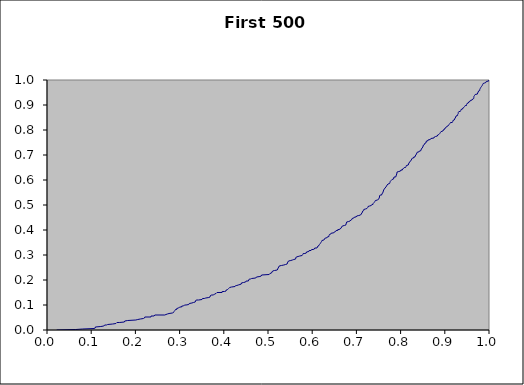
| Category | Series 0 |
|---|---|
| 0.021897918081891826 | 0 |
| 0.021897918081891826 | 0.002 |
| 0.06523315118367282 | 0.002 |
| 0.06523315118367282 | 0.004 |
| 0.0807544607324291 | 0.004 |
| 0.0807544607324291 | 0.006 |
| 0.10646404156951107 | 0.006 |
| 0.10646404156951107 | 0.008 |
| 0.1092573643612986 | 0.008 |
| 0.1092573643612986 | 0.01 |
| 0.10928343912602351 | 0.01 |
| 0.10928343912602351 | 0.012 |
| 0.11061091958944612 | 0.012 |
| 0.11061091958944612 | 0.014 |
| 0.12171973786751943 | 0.014 |
| 0.12171973786751943 | 0.016 |
| 0.1285424942450191 | 0.016 |
| 0.1285424942450191 | 0.018 |
| 0.1304585118417624 | 0.018 |
| 0.1304585118417624 | 0.02 |
| 0.13455305386940608 | 0.02 |
| 0.13455305386940608 | 0.022 |
| 0.13728534370316464 | 0.022 |
| 0.13728534370316464 | 0.024 |
| 0.14861249581178348 | 0.024 |
| 0.14861249581178348 | 0.026 |
| 0.15590705263605067 | 0.026 |
| 0.15590705263605067 | 0.028 |
| 0.1581368723343945 | 0.028 |
| 0.1581368723343945 | 0.03 |
| 0.16342433042483748 | 0.03 |
| 0.16342433042483748 | 0.032 |
| 0.1750887045038983 | 0.032 |
| 0.1750887045038983 | 0.034 |
| 0.17592749082593775 | 0.034 |
| 0.17592749082593775 | 0.036 |
| 0.17764236055978683 | 0.036 |
| 0.17764236055978683 | 0.038 |
| 0.18276183317802958 | 0.038 |
| 0.18276183317802958 | 0.04 |
| 0.20105487485812018 | 0.04 |
| 0.20105487485812018 | 0.042 |
| 0.20536459177715305 | 0.042 |
| 0.20536459177715305 | 0.044 |
| 0.21104864177050434 | 0.044 |
| 0.21104864177050434 | 0.046 |
| 0.21815375393502112 | 0.046 |
| 0.21815375393502112 | 0.048 |
| 0.22053192893236662 | 0.048 |
| 0.22053192893236662 | 0.05 |
| 0.22124137839260483 | 0.05 |
| 0.22124137839260483 | 0.052 |
| 0.2350986549685867 | 0.052 |
| 0.2350986549685867 | 0.054 |
| 0.23540107716843792 | 0.054 |
| 0.23540107716843792 | 0.056 |
| 0.24229875351471067 | 0.056 |
| 0.24229875351471067 | 0.058 |
| 0.24387414313903658 | 0.058 |
| 0.24387414313903658 | 0.06 |
| 0.2664827592374227 | 0.06 |
| 0.2664827592374227 | 0.062 |
| 0.26918575447161736 | 0.062 |
| 0.26918575447161736 | 0.064 |
| 0.2722355204352449 | 0.064 |
| 0.2722355204352449 | 0.066 |
| 0.2761165909060285 | 0.066 |
| 0.2761165909060285 | 0.068 |
| 0.2835442600330927 | 0.068 |
| 0.2835442600330927 | 0.07 |
| 0.2862815536726706 | 0.07 |
| 0.2862815536726706 | 0.072 |
| 0.2874402215660074 | 0.072 |
| 0.2874402215660074 | 0.074 |
| 0.2889093945239742 | 0.074 |
| 0.2889093945239742 | 0.076 |
| 0.2893299529715815 | 0.076 |
| 0.2893299529715815 | 0.078 |
| 0.29059601815584263 | 0.078 |
| 0.29059601815584263 | 0.08 |
| 0.29066765360203234 | 0.08 |
| 0.29066765360203234 | 0.082 |
| 0.293387623630287 | 0.082 |
| 0.293387623630287 | 0.084 |
| 0.293471716909933 | 0.084 |
| 0.293471716909933 | 0.086 |
| 0.29422580143166954 | 0.086 |
| 0.29422580143166954 | 0.088 |
| 0.2977863811714314 | 0.088 |
| 0.2977863811714314 | 0.09 |
| 0.30002222580208876 | 0.09 |
| 0.30002222580208876 | 0.092 |
| 0.30449822905675206 | 0.092 |
| 0.30449822905675206 | 0.094 |
| 0.3049871862406665 | 0.094 |
| 0.3049871862406665 | 0.096 |
| 0.3087590019793998 | 0.096 |
| 0.3087590019793998 | 0.098 |
| 0.3109875620651161 | 0.098 |
| 0.3109875620651161 | 0.1 |
| 0.3145524105345959 | 0.1 |
| 0.3145524105345959 | 0.102 |
| 0.32080660699942676 | 0.102 |
| 0.32080660699942676 | 0.104 |
| 0.3218245111582825 | 0.104 |
| 0.3218245111582825 | 0.106 |
| 0.32325844579217367 | 0.106 |
| 0.32325844579217367 | 0.108 |
| 0.3278516912646725 | 0.108 |
| 0.3278516912646725 | 0.11 |
| 0.3311631151056512 | 0.11 |
| 0.3311631151056512 | 0.112 |
| 0.33536681212985264 | 0.112 |
| 0.33536681212985264 | 0.114 |
| 0.3360530583206744 | 0.114 |
| 0.3360530583206744 | 0.116 |
| 0.33727365891195454 | 0.116 |
| 0.33727365891195454 | 0.118 |
| 0.33761581012432174 | 0.118 |
| 0.33761581012432174 | 0.12 |
| 0.34282517261200224 | 0.12 |
| 0.34282517261200224 | 0.122 |
| 0.35070825327676586 | 0.122 |
| 0.35070825327676586 | 0.124 |
| 0.3517873820542869 | 0.124 |
| 0.3517873820542869 | 0.126 |
| 0.35574020971307757 | 0.126 |
| 0.35574020971307757 | 0.128 |
| 0.35921498873511853 | 0.128 |
| 0.35921498873511853 | 0.13 |
| 0.36608536857781754 | 0.13 |
| 0.36608536857781754 | 0.132 |
| 0.3689463281720448 | 0.132 |
| 0.3689463281720448 | 0.134 |
| 0.3692220418669596 | 0.134 |
| 0.3692220418669596 | 0.136 |
| 0.370487820085008 | 0.136 |
| 0.370487820085008 | 0.138 |
| 0.3714711372366517 | 0.138 |
| 0.3714711372366517 | 0.14 |
| 0.3768092378812035 | 0.14 |
| 0.3768092378812035 | 0.142 |
| 0.3790477668345028 | 0.142 |
| 0.3790477668345028 | 0.144 |
| 0.3807772708818114 | 0.144 |
| 0.3807772708818114 | 0.146 |
| 0.3824347860305835 | 0.146 |
| 0.3824347860305835 | 0.148 |
| 0.3845599507331962 | 0.148 |
| 0.3845599507331962 | 0.15 |
| 0.39610399991559364 | 0.15 |
| 0.39610399991559364 | 0.152 |
| 0.39628005008507333 | 0.152 |
| 0.39628005008507333 | 0.154 |
| 0.4016791358136964 | 0.154 |
| 0.4016791358136964 | 0.156 |
| 0.4050719875682554 | 0.156 |
| 0.4050719875682554 | 0.158 |
| 0.40547329463613474 | 0.158 |
| 0.40547329463613474 | 0.16 |
| 0.4058862553466577 | 0.16 |
| 0.4058862553466577 | 0.162 |
| 0.4087463465819142 | 0.162 |
| 0.4087463465819142 | 0.164 |
| 0.4109655259528265 | 0.164 |
| 0.4109655259528265 | 0.166 |
| 0.41125949607083 | 0.166 |
| 0.41125949607083 | 0.168 |
| 0.4131650342620507 | 0.168 |
| 0.4131650342620507 | 0.17 |
| 0.41357675492989415 | 0.17 |
| 0.41357675492989415 | 0.172 |
| 0.417493631801864 | 0.172 |
| 0.417493631801864 | 0.174 |
| 0.4255545243436441 | 0.174 |
| 0.4255545243436441 | 0.176 |
| 0.4269480113402916 | 0.176 |
| 0.4269480113402916 | 0.178 |
| 0.4294714508657256 | 0.178 |
| 0.4294714508657256 | 0.18 |
| 0.43261605053863406 | 0.18 |
| 0.43261605053863406 | 0.182 |
| 0.43664353031998987 | 0.182 |
| 0.43664353031998987 | 0.184 |
| 0.4396434383547464 | 0.184 |
| 0.4396434383547464 | 0.186 |
| 0.4397017219194328 | 0.186 |
| 0.4397017219194328 | 0.188 |
| 0.44053109392780376 | 0.188 |
| 0.44053109392780376 | 0.19 |
| 0.4445297881575609 | 0.19 |
| 0.4445297881575609 | 0.192 |
| 0.44939216450777775 | 0.192 |
| 0.44939216450777775 | 0.194 |
| 0.450599185572192 | 0.194 |
| 0.450599185572192 | 0.196 |
| 0.4555851932242986 | 0.196 |
| 0.4555851932242986 | 0.198 |
| 0.4565087693150965 | 0.198 |
| 0.4565087693150965 | 0.2 |
| 0.457504789345731 | 0.2 |
| 0.457504789345731 | 0.202 |
| 0.45787742815257404 | 0.202 |
| 0.45787742815257404 | 0.204 |
| 0.46041356228416236 | 0.204 |
| 0.46041356228416236 | 0.206 |
| 0.46294729006585267 | 0.206 |
| 0.46294729006585267 | 0.208 |
| 0.4723377382072869 | 0.208 |
| 0.4723377382072869 | 0.21 |
| 0.47379882273148494 | 0.21 |
| 0.47379882273148494 | 0.212 |
| 0.4747578372860722 | 0.212 |
| 0.4747578372860722 | 0.214 |
| 0.4817563442199761 | 0.214 |
| 0.4817563442199761 | 0.216 |
| 0.4845554604608543 | 0.216 |
| 0.4845554604608543 | 0.218 |
| 0.4855100597031753 | 0.218 |
| 0.4855100597031753 | 0.22 |
| 0.48736225417345536 | 0.22 |
| 0.48736225417345536 | 0.222 |
| 0.5026501339941281 | 0.222 |
| 0.5026501339941281 | 0.224 |
| 0.5042813666066718 | 0.224 |
| 0.5042813666066718 | 0.226 |
| 0.5045342969493823 | 0.226 |
| 0.5045342969493823 | 0.228 |
| 0.5079773136335938 | 0.228 |
| 0.5079773136335938 | 0.23 |
| 0.5089497839653756 | 0.23 |
| 0.5089497839653756 | 0.232 |
| 0.5093478847308652 | 0.232 |
| 0.5093478847308652 | 0.234 |
| 0.5105190893524388 | 0.234 |
| 0.5105190893524388 | 0.236 |
| 0.5111668536550172 | 0.236 |
| 0.5111668536550172 | 0.238 |
| 0.514722558956099 | 0.238 |
| 0.514722558956099 | 0.24 |
| 0.5209627517010066 | 0.24 |
| 0.5209627517010066 | 0.242 |
| 0.5222140856684551 | 0.242 |
| 0.5222140856684551 | 0.244 |
| 0.5224796490614518 | 0.244 |
| 0.5224796490614518 | 0.246 |
| 0.5226923157140931 | 0.246 |
| 0.5226923157140931 | 0.248 |
| 0.5232346469884467 | 0.248 |
| 0.5232346469884467 | 0.25 |
| 0.524535123631277 | 0.25 |
| 0.524535123631277 | 0.252 |
| 0.5251040575780742 | 0.252 |
| 0.5251040575780742 | 0.254 |
| 0.5252651934115584 | 0.254 |
| 0.5252651934115584 | 0.256 |
| 0.5275197052584345 | 0.256 |
| 0.5275197052584345 | 0.258 |
| 0.5302459693545999 | 0.258 |
| 0.5302459693545999 | 0.26 |
| 0.5358197725093767 | 0.26 |
| 0.5358197725093767 | 0.262 |
| 0.5395910689444929 | 0.262 |
| 0.5395910689444929 | 0.264 |
| 0.5433550089578614 | 0.264 |
| 0.5433550089578614 | 0.266 |
| 0.5438411885343831 | 0.266 |
| 0.5438411885343831 | 0.268 |
| 0.5440309159428603 | 0.268 |
| 0.5440309159428603 | 0.27 |
| 0.5450122353596646 | 0.27 |
| 0.5450122353596646 | 0.272 |
| 0.545947966389704 | 0.272 |
| 0.545947966389704 | 0.274 |
| 0.5463656162412323 | 0.274 |
| 0.5463656162412323 | 0.276 |
| 0.5464352212521673 | 0.276 |
| 0.5464352212521673 | 0.278 |
| 0.5516540407877566 | 0.278 |
| 0.5516540407877566 | 0.28 |
| 0.5551500112860211 | 0.28 |
| 0.5551500112860211 | 0.282 |
| 0.5583286015876231 | 0.282 |
| 0.5583286015876231 | 0.284 |
| 0.5626280067760266 | 0.284 |
| 0.5626280067760266 | 0.286 |
| 0.5627445769298121 | 0.286 |
| 0.5627445769298121 | 0.288 |
| 0.5638732604246404 | 0.288 |
| 0.5638732604246404 | 0.29 |
| 0.5639650438164676 | 0.29 |
| 0.5639650438164676 | 0.292 |
| 0.5643976594642972 | 0.292 |
| 0.5643976594642972 | 0.294 |
| 0.5680648654399378 | 0.294 |
| 0.5680648654399378 | 0.296 |
| 0.5718063373089591 | 0.296 |
| 0.5718063373089591 | 0.298 |
| 0.5771866483174436 | 0.298 |
| 0.5771866483174436 | 0.3 |
| 0.5786389403124875 | 0.3 |
| 0.5786389403124875 | 0.302 |
| 0.5787774493492687 | 0.302 |
| 0.5787774493492687 | 0.304 |
| 0.5796776962765396 | 0.304 |
| 0.5796776962765396 | 0.306 |
| 0.5833835432091734 | 0.306 |
| 0.5833835432091734 | 0.308 |
| 0.586673400013422 | 0.308 |
| 0.586673400013422 | 0.31 |
| 0.5869734183578232 | 0.31 |
| 0.5869734183578232 | 0.312 |
| 0.587597544816653 | 0.312 |
| 0.587597544816653 | 0.314 |
| 0.5924530931749203 | 0.314 |
| 0.5924530931749203 | 0.316 |
| 0.5931702757522926 | 0.316 |
| 0.5931702757522926 | 0.318 |
| 0.59746225229825 | 0.318 |
| 0.59746225229825 | 0.32 |
| 0.5986512667009289 | 0.32 |
| 0.5986512667009289 | 0.322 |
| 0.6020101268498207 | 0.322 |
| 0.6020101268498207 | 0.324 |
| 0.6051132932854387 | 0.324 |
| 0.6051132932854387 | 0.326 |
| 0.6057763103128806 | 0.326 |
| 0.6057763103128806 | 0.328 |
| 0.6106860507347589 | 0.328 |
| 0.6106860507347589 | 0.33 |
| 0.6119188503874389 | 0.33 |
| 0.6119188503874389 | 0.332 |
| 0.6121558833473152 | 0.332 |
| 0.6121558833473152 | 0.334 |
| 0.6129847978524068 | 0.334 |
| 0.6129847978524068 | 0.336 |
| 0.6145048868322224 | 0.336 |
| 0.6145048868322224 | 0.338 |
| 0.6154327094016 | 0.338 |
| 0.6154327094016 | 0.34 |
| 0.616355204360489 | 0.34 |
| 0.616355204360489 | 0.342 |
| 0.6180251090993006 | 0.342 |
| 0.6180251090993006 | 0.344 |
| 0.6182573211400452 | 0.344 |
| 0.6182573211400452 | 0.346 |
| 0.6188268152584875 | 0.346 |
| 0.6188268152584875 | 0.348 |
| 0.6196592609244207 | 0.348 |
| 0.6196592609244207 | 0.35 |
| 0.6202401608683943 | 0.35 |
| 0.6202401608683943 | 0.352 |
| 0.6212044414760152 | 0.352 |
| 0.6212044414760152 | 0.354 |
| 0.6214380213070004 | 0.354 |
| 0.6214380213070004 | 0.356 |
| 0.6219687799350214 | 0.356 |
| 0.6219687799350214 | 0.358 |
| 0.6236564252665228 | 0.358 |
| 0.6236564252665228 | 0.36 |
| 0.6264756570670645 | 0.36 |
| 0.6264756570670645 | 0.362 |
| 0.627905607655712 | 0.362 |
| 0.627905607655712 | 0.364 |
| 0.6287738836301561 | 0.364 |
| 0.6287738836301561 | 0.366 |
| 0.6294430686842593 | 0.366 |
| 0.6294430686842593 | 0.368 |
| 0.6325986662555002 | 0.368 |
| 0.6325986662555002 | 0.37 |
| 0.6339704736572748 | 0.37 |
| 0.6339704736572748 | 0.372 |
| 0.6351498407558812 | 0.372 |
| 0.6351498407558812 | 0.374 |
| 0.6379083372527639 | 0.374 |
| 0.6379083372527639 | 0.376 |
| 0.6381330027209235 | 0.376 |
| 0.6381330027209235 | 0.378 |
| 0.6387644151629712 | 0.378 |
| 0.6387644151629712 | 0.38 |
| 0.6389945888632037 | 0.38 |
| 0.6389945888632037 | 0.382 |
| 0.639362838360495 | 0.382 |
| 0.639362838360495 | 0.384 |
| 0.6422337999780982 | 0.384 |
| 0.6422337999780982 | 0.386 |
| 0.64350231229169 | 0.386 |
| 0.64350231229169 | 0.388 |
| 0.6483094953767626 | 0.388 |
| 0.6483094953767626 | 0.39 |
| 0.6498340048658052 | 0.39 |
| 0.6498340048658052 | 0.392 |
| 0.6517704356523994 | 0.392 |
| 0.6517704356523994 | 0.394 |
| 0.6530821035511961 | 0.394 |
| 0.6530821035511961 | 0.396 |
| 0.654077805916523 | 0.396 |
| 0.654077805916523 | 0.398 |
| 0.6579374729901266 | 0.398 |
| 0.6579374729901266 | 0.4 |
| 0.6579604586271598 | 0.4 |
| 0.6579604586271598 | 0.402 |
| 0.660586238051264 | 0.402 |
| 0.660586238051264 | 0.404 |
| 0.6633924613668194 | 0.404 |
| 0.6633924613668194 | 0.406 |
| 0.6652625014112356 | 0.406 |
| 0.6652625014112356 | 0.408 |
| 0.6666106008838641 | 0.408 |
| 0.6666106008838641 | 0.41 |
| 0.6667663082441025 | 0.41 |
| 0.6667663082441025 | 0.412 |
| 0.6676059935887697 | 0.412 |
| 0.6676059935887697 | 0.414 |
| 0.6680865847296211 | 0.414 |
| 0.6680865847296211 | 0.416 |
| 0.6686750506797231 | 0.416 |
| 0.6686750506797231 | 0.418 |
| 0.67283254265387 | 0.418 |
| 0.67283254265387 | 0.42 |
| 0.6762284886850896 | 0.42 |
| 0.6762284886850896 | 0.422 |
| 0.6763473046152666 | 0.422 |
| 0.6763473046152666 | 0.424 |
| 0.6767232202972496 | 0.424 |
| 0.6767232202972496 | 0.426 |
| 0.6776075672373701 | 0.426 |
| 0.6776075672373701 | 0.428 |
| 0.6778118258765987 | 0.428 |
| 0.6778118258765987 | 0.43 |
| 0.6778582361262263 | 0.43 |
| 0.6778582361262263 | 0.432 |
| 0.6789905823304688 | 0.432 |
| 0.6789905823304688 | 0.434 |
| 0.682624196593867 | 0.434 |
| 0.682624196593867 | 0.436 |
| 0.6855616080756904 | 0.436 |
| 0.6855616080756904 | 0.438 |
| 0.6874446985646274 | 0.438 |
| 0.6874446985646274 | 0.44 |
| 0.6896915569578116 | 0.44 |
| 0.6896915569578116 | 0.442 |
| 0.6898571975173683 | 0.442 |
| 0.6898571975173683 | 0.444 |
| 0.6903026574554162 | 0.444 |
| 0.6903026574554162 | 0.446 |
| 0.6923813339461344 | 0.446 |
| 0.6923813339461344 | 0.448 |
| 0.6941687461939142 | 0.448 |
| 0.6941687461939142 | 0.45 |
| 0.6958572557928987 | 0.45 |
| 0.6958572557928987 | 0.452 |
| 0.6992722281819722 | 0.452 |
| 0.6992722281819722 | 0.454 |
| 0.7006465266287069 | 0.454 |
| 0.7006465266287069 | 0.456 |
| 0.7025308553214654 | 0.456 |
| 0.7025308553214654 | 0.458 |
| 0.7053757134470637 | 0.458 |
| 0.7053757134470637 | 0.46 |
| 0.7094359861818292 | 0.46 |
| 0.7094359861818292 | 0.462 |
| 0.7110020552571784 | 0.462 |
| 0.7110020552571784 | 0.464 |
| 0.7115600840500821 | 0.464 |
| 0.7115600840500821 | 0.466 |
| 0.7123260721053666 | 0.466 |
| 0.7123260721053666 | 0.468 |
| 0.7133662142828301 | 0.468 |
| 0.7133662142828301 | 0.47 |
| 0.7138754298990462 | 0.47 |
| 0.7138754298990462 | 0.472 |
| 0.7141230464399799 | 0.472 |
| 0.7141230464399799 | 0.474 |
| 0.7141568127062209 | 0.474 |
| 0.7141568127062209 | 0.476 |
| 0.715992288373078 | 0.476 |
| 0.715992288373078 | 0.478 |
| 0.7165571234462058 | 0.478 |
| 0.7165571234462058 | 0.48 |
| 0.7166873041495803 | 0.48 |
| 0.7166873041495803 | 0.482 |
| 0.718014460256699 | 0.482 |
| 0.718014460256699 | 0.484 |
| 0.7203130081390077 | 0.484 |
| 0.7203130081390077 | 0.486 |
| 0.7237741407136123 | 0.486 |
| 0.7237741407136123 | 0.488 |
| 0.7256004104927262 | 0.488 |
| 0.7256004104927262 | 0.49 |
| 0.7257639014780729 | 0.49 |
| 0.7257639014780729 | 0.492 |
| 0.726229524773025 | 0.492 |
| 0.726229524773025 | 0.494 |
| 0.7264253804586218 | 0.494 |
| 0.7264253804586218 | 0.496 |
| 0.7296632391733259 | 0.496 |
| 0.7296632391733259 | 0.498 |
| 0.733744908399423 | 0.498 |
| 0.733744908399423 | 0.5 |
| 0.7350158527704594 | 0.5 |
| 0.7350158527704594 | 0.502 |
| 0.7374461408638304 | 0.502 |
| 0.7374461408638304 | 0.504 |
| 0.7379289512883268 | 0.504 |
| 0.7379289512883268 | 0.506 |
| 0.7388949778293331 | 0.506 |
| 0.7388949778293331 | 0.508 |
| 0.7401082279542218 | 0.508 |
| 0.7401082279542218 | 0.51 |
| 0.7408600242821723 | 0.51 |
| 0.7408600242821723 | 0.512 |
| 0.741719255484518 | 0.512 |
| 0.741719255484518 | 0.514 |
| 0.7417217741133836 | 0.514 |
| 0.7417217741133836 | 0.516 |
| 0.7429141899212883 | 0.516 |
| 0.7429141899212883 | 0.518 |
| 0.7441281625817132 | 0.518 |
| 0.7441281625817132 | 0.52 |
| 0.7480595669527663 | 0.52 |
| 0.7480595669527663 | 0.522 |
| 0.7502604141916246 | 0.522 |
| 0.7502604141916246 | 0.524 |
| 0.7510292667036068 | 0.524 |
| 0.7510292667036068 | 0.526 |
| 0.7515503769155605 | 0.526 |
| 0.7515503769155605 | 0.528 |
| 0.7518715577794326 | 0.528 |
| 0.7518715577794326 | 0.53 |
| 0.7522530038735372 | 0.53 |
| 0.7522530038735372 | 0.532 |
| 0.7522733484202527 | 0.532 |
| 0.7522733484202527 | 0.534 |
| 0.7523297901009789 | 0.534 |
| 0.7523297901009789 | 0.536 |
| 0.753149487942095 | 0.536 |
| 0.753149487942095 | 0.538 |
| 0.7538860990464556 | 0.538 |
| 0.7538860990464556 | 0.54 |
| 0.7572945411749765 | 0.54 |
| 0.7572945411749765 | 0.542 |
| 0.7574084775031177 | 0.542 |
| 0.7574084775031177 | 0.544 |
| 0.7577527549174666 | 0.544 |
| 0.7577527549174666 | 0.546 |
| 0.7595407718475183 | 0.546 |
| 0.7595407718475183 | 0.548 |
| 0.7595451452805143 | 0.548 |
| 0.7595451452805143 | 0.55 |
| 0.7601660612169587 | 0.55 |
| 0.7601660612169587 | 0.552 |
| 0.7608106611630955 | 0.552 |
| 0.7608106611630955 | 0.554 |
| 0.7611422608573828 | 0.554 |
| 0.7611422608573828 | 0.556 |
| 0.7612205935325752 | 0.556 |
| 0.7612205935325752 | 0.558 |
| 0.761608348386071 | 0.558 |
| 0.761608348386071 | 0.56 |
| 0.7618261464744778 | 0.56 |
| 0.7618261464744778 | 0.562 |
| 0.763151743735293 | 0.562 |
| 0.763151743735293 | 0.564 |
| 0.7634970549895383 | 0.564 |
| 0.7634970549895383 | 0.566 |
| 0.7648489281646802 | 0.566 |
| 0.7648489281646802 | 0.568 |
| 0.7652778181574478 | 0.568 |
| 0.7652778181574478 | 0.57 |
| 0.7667490758198615 | 0.57 |
| 0.7667490758198615 | 0.572 |
| 0.7671775008141282 | 0.572 |
| 0.7671775008141282 | 0.574 |
| 0.768291985361771 | 0.574 |
| 0.768291985361771 | 0.576 |
| 0.768592362393536 | 0.576 |
| 0.768592362393536 | 0.578 |
| 0.7694822541234644 | 0.578 |
| 0.7694822541234644 | 0.58 |
| 0.7705487870905148 | 0.58 |
| 0.7705487870905148 | 0.582 |
| 0.771520572440686 | 0.582 |
| 0.771520572440686 | 0.584 |
| 0.7736299643654316 | 0.584 |
| 0.7736299643654316 | 0.586 |
| 0.7751330488475033 | 0.586 |
| 0.7751330488475033 | 0.588 |
| 0.7758440312552851 | 0.588 |
| 0.7758440312552851 | 0.59 |
| 0.7759180205744041 | 0.59 |
| 0.7759180205744041 | 0.592 |
| 0.7765300462755913 | 0.592 |
| 0.7765300462755913 | 0.594 |
| 0.7766462401101253 | 0.594 |
| 0.7766462401101253 | 0.596 |
| 0.7785057478894849 | 0.596 |
| 0.7785057478894849 | 0.598 |
| 0.7793812749402714 | 0.598 |
| 0.7793812749402714 | 0.6 |
| 0.7804435078850375 | 0.6 |
| 0.7804435078850375 | 0.602 |
| 0.7825627045731666 | 0.602 |
| 0.7825627045731666 | 0.604 |
| 0.7841050655654225 | 0.604 |
| 0.7841050655654225 | 0.606 |
| 0.7844876772279082 | 0.606 |
| 0.7844876772279082 | 0.608 |
| 0.784816215249799 | 0.608 |
| 0.784816215249799 | 0.61 |
| 0.7850951421824672 | 0.61 |
| 0.7850951421824672 | 0.612 |
| 0.7888425791183485 | 0.612 |
| 0.7888425791183485 | 0.614 |
| 0.7897232454222108 | 0.614 |
| 0.7897232454222108 | 0.616 |
| 0.7901772275603912 | 0.616 |
| 0.7901772275603912 | 0.618 |
| 0.790353047532036 | 0.618 |
| 0.790353047532036 | 0.62 |
| 0.7909670192152767 | 0.62 |
| 0.7909670192152767 | 0.622 |
| 0.7912846154829163 | 0.622 |
| 0.7912846154829163 | 0.624 |
| 0.7916270258998034 | 0.624 |
| 0.7916270258998034 | 0.626 |
| 0.7917059927449835 | 0.626 |
| 0.7917059927449835 | 0.628 |
| 0.7918641404203914 | 0.628 |
| 0.7918641404203914 | 0.63 |
| 0.7920255003484298 | 0.63 |
| 0.7920255003484298 | 0.632 |
| 0.7936341382131215 | 0.632 |
| 0.7936341382131215 | 0.634 |
| 0.7959860246398435 | 0.634 |
| 0.7959860246398435 | 0.636 |
| 0.8000113413325388 | 0.636 |
| 0.8000113413325388 | 0.638 |
| 0.8006703315547062 | 0.638 |
| 0.8006703315547062 | 0.64 |
| 0.8040040782992138 | 0.64 |
| 0.8040040782992138 | 0.642 |
| 0.8042519221969704 | 0.642 |
| 0.8042519221969704 | 0.644 |
| 0.8056901569049223 | 0.644 |
| 0.8056901569049223 | 0.646 |
| 0.8068058462702486 | 0.646 |
| 0.8068058462702486 | 0.648 |
| 0.8083528484278573 | 0.648 |
| 0.8083528484278573 | 0.65 |
| 0.8112496630574458 | 0.65 |
| 0.8112496630574458 | 0.652 |
| 0.8123750366712341 | 0.652 |
| 0.8123750366712341 | 0.654 |
| 0.8124332449936501 | 0.654 |
| 0.8124332449936501 | 0.656 |
| 0.8130650416595592 | 0.656 |
| 0.8130650416595592 | 0.658 |
| 0.8141989713501431 | 0.658 |
| 0.8141989713501431 | 0.66 |
| 0.8173800327933877 | 0.66 |
| 0.8173800327933877 | 0.662 |
| 0.81801863560738 | 0.662 |
| 0.81801863560738 | 0.664 |
| 0.8184889028828422 | 0.664 |
| 0.8184889028828422 | 0.666 |
| 0.8188853070813994 | 0.666 |
| 0.8188853070813994 | 0.668 |
| 0.8200465091183649 | 0.668 |
| 0.8200465091183649 | 0.67 |
| 0.8206241466640288 | 0.67 |
| 0.8206241466640288 | 0.672 |
| 0.8217598363746983 | 0.672 |
| 0.8217598363746983 | 0.674 |
| 0.8223900363704881 | 0.674 |
| 0.8223900363704881 | 0.676 |
| 0.8241072458204203 | 0.676 |
| 0.8241072458204203 | 0.678 |
| 0.8242858136484837 | 0.678 |
| 0.8242858136484837 | 0.68 |
| 0.8243149197878812 | 0.68 |
| 0.8243149197878812 | 0.682 |
| 0.8251191765501322 | 0.682 |
| 0.8251191765501322 | 0.684 |
| 0.8263336720188437 | 0.684 |
| 0.8263336720188437 | 0.686 |
| 0.8270432951745045 | 0.686 |
| 0.8270432951745045 | 0.688 |
| 0.8293808328484124 | 0.688 |
| 0.8293808328484124 | 0.69 |
| 0.8297800955911879 | 0.69 |
| 0.8297800955911879 | 0.692 |
| 0.8324097034456521 | 0.692 |
| 0.8324097034456521 | 0.694 |
| 0.8328880273734436 | 0.694 |
| 0.8328880273734436 | 0.696 |
| 0.8338238696729474 | 0.696 |
| 0.8338238696729474 | 0.698 |
| 0.8345467092771438 | 0.698 |
| 0.8345467092771438 | 0.7 |
| 0.8356865237403466 | 0.7 |
| 0.8356865237403466 | 0.702 |
| 0.8358142915470234 | 0.702 |
| 0.8358142915470234 | 0.704 |
| 0.8365581017247976 | 0.704 |
| 0.8365581017247976 | 0.706 |
| 0.8368748553965812 | 0.706 |
| 0.8368748553965812 | 0.708 |
| 0.8368971318759624 | 0.708 |
| 0.8368971318759624 | 0.71 |
| 0.8381487083846549 | 0.71 |
| 0.8381487083846549 | 0.712 |
| 0.8412481949805983 | 0.712 |
| 0.8412481949805983 | 0.714 |
| 0.8424181402431646 | 0.714 |
| 0.8424181402431646 | 0.716 |
| 0.8449344520976512 | 0.716 |
| 0.8449344520976512 | 0.718 |
| 0.8462637258761989 | 0.718 |
| 0.8462637258761989 | 0.72 |
| 0.8464534147030698 | 0.72 |
| 0.8464534147030698 | 0.722 |
| 0.8468826699629495 | 0.722 |
| 0.8468826699629495 | 0.724 |
| 0.847934235921023 | 0.724 |
| 0.847934235921023 | 0.726 |
| 0.8486969115973722 | 0.726 |
| 0.8486969115973722 | 0.728 |
| 0.8498276110240766 | 0.728 |
| 0.8498276110240766 | 0.73 |
| 0.8503297338808143 | 0.73 |
| 0.8503297338808143 | 0.732 |
| 0.8509422197578367 | 0.732 |
| 0.8509422197578367 | 0.734 |
| 0.8509467715962451 | 0.734 |
| 0.8509467715962451 | 0.736 |
| 0.8514861288429342 | 0.736 |
| 0.8514861288429342 | 0.738 |
| 0.8516625308197437 | 0.738 |
| 0.8516625308197437 | 0.74 |
| 0.8525172238569962 | 0.74 |
| 0.8525172238569962 | 0.742 |
| 0.8540659785649526 | 0.742 |
| 0.8540659785649526 | 0.744 |
| 0.8542639027203954 | 0.744 |
| 0.8542639027203954 | 0.746 |
| 0.8563559794500828 | 0.746 |
| 0.8563559794500828 | 0.748 |
| 0.8572194716819215 | 0.748 |
| 0.8572194716819215 | 0.75 |
| 0.8576670890821496 | 0.75 |
| 0.8576670890821496 | 0.752 |
| 0.8579432512126182 | 0.752 |
| 0.8579432512126182 | 0.754 |
| 0.8585389932581374 | 0.754 |
| 0.8585389932581374 | 0.756 |
| 0.8610956743443839 | 0.756 |
| 0.8610956743443839 | 0.758 |
| 0.8617789274494094 | 0.758 |
| 0.8617789274494094 | 0.76 |
| 0.8621866135025469 | 0.76 |
| 0.8621866135025469 | 0.762 |
| 0.8672166620295092 | 0.762 |
| 0.8672166620295092 | 0.764 |
| 0.8684517869629752 | 0.764 |
| 0.8684517869629752 | 0.766 |
| 0.8702295446381971 | 0.766 |
| 0.8702295446381971 | 0.768 |
| 0.8754295625026918 | 0.768 |
| 0.8754295625026918 | 0.77 |
| 0.8762464260300574 | 0.77 |
| 0.8762464260300574 | 0.772 |
| 0.8776995580871099 | 0.772 |
| 0.8776995580871099 | 0.774 |
| 0.8789527615539244 | 0.774 |
| 0.8789527615539244 | 0.776 |
| 0.8832384395424301 | 0.776 |
| 0.8832384395424301 | 0.778 |
| 0.8837904812853027 | 0.778 |
| 0.8837904812853027 | 0.78 |
| 0.8842790969423092 | 0.78 |
| 0.8842790969423092 | 0.782 |
| 0.8864422194561734 | 0.782 |
| 0.8864422194561734 | 0.784 |
| 0.8886017461145103 | 0.784 |
| 0.8886017461145103 | 0.786 |
| 0.8892236054804247 | 0.786 |
| 0.8892236054804247 | 0.788 |
| 0.8899659757051267 | 0.788 |
| 0.8899659757051267 | 0.79 |
| 0.8905729275027437 | 0.79 |
| 0.8905729275027437 | 0.792 |
| 0.8916106857938936 | 0.792 |
| 0.8916106857938936 | 0.794 |
| 0.8943125261442066 | 0.794 |
| 0.8943125261442066 | 0.796 |
| 0.8952492938771661 | 0.796 |
| 0.8952492938771661 | 0.798 |
| 0.8961166380914222 | 0.798 |
| 0.8961166380914222 | 0.8 |
| 0.8982400624029053 | 0.8 |
| 0.8982400624029053 | 0.802 |
| 0.898287302988112 | 0.802 |
| 0.898287302988112 | 0.804 |
| 0.9002835993211556 | 0.804 |
| 0.9002835993211556 | 0.806 |
| 0.9010818398027713 | 0.806 |
| 0.9010818398027713 | 0.808 |
| 0.9016767808149143 | 0.808 |
| 0.9016767808149143 | 0.81 |
| 0.9025793706840394 | 0.81 |
| 0.9025793706840394 | 0.812 |
| 0.9043851204081507 | 0.812 |
| 0.9043851204081507 | 0.814 |
| 0.9055255466345281 | 0.814 |
| 0.9055255466345281 | 0.816 |
| 0.9069406250545172 | 0.816 |
| 0.9069406250545172 | 0.818 |
| 0.9083978631796679 | 0.818 |
| 0.9083978631796679 | 0.82 |
| 0.9096458951040006 | 0.82 |
| 0.9096458951040006 | 0.822 |
| 0.9112151593725827 | 0.822 |
| 0.9112151593725827 | 0.824 |
| 0.9114609449712598 | 0.824 |
| 0.9114609449712598 | 0.826 |
| 0.9125297871441526 | 0.826 |
| 0.9125297871441526 | 0.828 |
| 0.9129371955157971 | 0.828 |
| 0.9129371955157971 | 0.83 |
| 0.9168645909890707 | 0.83 |
| 0.9168645909890707 | 0.832 |
| 0.9179266062903838 | 0.832 |
| 0.9179266062903838 | 0.834 |
| 0.9182228595021318 | 0.834 |
| 0.9182228595021318 | 0.836 |
| 0.918341497525214 | 0.836 |
| 0.918341497525214 | 0.838 |
| 0.9183462047341008 | 0.838 |
| 0.9183462047341008 | 0.84 |
| 0.921360306954295 | 0.84 |
| 0.921360306954295 | 0.842 |
| 0.9222637868510184 | 0.842 |
| 0.9222637868510184 | 0.844 |
| 0.9232308645500449 | 0.844 |
| 0.9232308645500449 | 0.846 |
| 0.9234589011089284 | 0.846 |
| 0.9234589011089284 | 0.848 |
| 0.9239416457986912 | 0.848 |
| 0.9239416457986912 | 0.85 |
| 0.924884238562547 | 0.85 |
| 0.924884238562547 | 0.852 |
| 0.9252117909185877 | 0.852 |
| 0.9252117909185877 | 0.854 |
| 0.9253484809317972 | 0.854 |
| 0.9253484809317972 | 0.856 |
| 0.9275963465979197 | 0.856 |
| 0.9275963465979197 | 0.858 |
| 0.9288882368658656 | 0.858 |
| 0.9288882368658656 | 0.86 |
| 0.9290918493653265 | 0.86 |
| 0.9290918493653265 | 0.862 |
| 0.9298329156326315 | 0.862 |
| 0.9298329156326315 | 0.864 |
| 0.9304165914145583 | 0.864 |
| 0.9304165914145583 | 0.866 |
| 0.9304389668029651 | 0.866 |
| 0.9304389668029651 | 0.868 |
| 0.9304836201211709 | 0.868 |
| 0.9304836201211709 | 0.87 |
| 0.9309847556801406 | 0.87 |
| 0.9309847556801406 | 0.872 |
| 0.9318876387736391 | 0.872 |
| 0.9318876387736391 | 0.874 |
| 0.9349417550124406 | 0.874 |
| 0.9349417550124406 | 0.876 |
| 0.936043671564411 | 0.876 |
| 0.936043671564411 | 0.878 |
| 0.9364978180899991 | 0.878 |
| 0.9364978180899991 | 0.88 |
| 0.9366596242966425 | 0.88 |
| 0.9366596242966425 | 0.882 |
| 0.9371016290629283 | 0.882 |
| 0.9371016290629283 | 0.884 |
| 0.9402772660585841 | 0.884 |
| 0.9402772660585841 | 0.886 |
| 0.9407192517339565 | 0.886 |
| 0.9407192517339565 | 0.888 |
| 0.9411552282165363 | 0.888 |
| 0.9411552282165363 | 0.89 |
| 0.9430230700013641 | 0.89 |
| 0.9430230700013641 | 0.892 |
| 0.944815155699801 | 0.892 |
| 0.944815155699801 | 0.894 |
| 0.9457128285459295 | 0.894 |
| 0.9457128285459295 | 0.896 |
| 0.946252284748408 | 0.896 |
| 0.946252284748408 | 0.898 |
| 0.9491216997048142 | 0.898 |
| 0.9491216997048142 | 0.9 |
| 0.9492951597320071 | 0.9 |
| 0.9492951597320071 | 0.902 |
| 0.9493443821250903 | 0.902 |
| 0.9493443821250903 | 0.904 |
| 0.9501842958160471 | 0.904 |
| 0.9501842958160471 | 0.906 |
| 0.950584071378641 | 0.906 |
| 0.950584071378641 | 0.908 |
| 0.9532496911084124 | 0.908 |
| 0.9532496911084124 | 0.91 |
| 0.9537783191014101 | 0.91 |
| 0.9537783191014101 | 0.912 |
| 0.9548197958900058 | 0.912 |
| 0.9548197958900058 | 0.914 |
| 0.9570286675066099 | 0.914 |
| 0.9570286675066099 | 0.916 |
| 0.9576249920695005 | 0.916 |
| 0.9576249920695005 | 0.918 |
| 0.9593024444312359 | 0.918 |
| 0.9593024444312359 | 0.92 |
| 0.9617825148072766 | 0.92 |
| 0.9617825148072766 | 0.922 |
| 0.9630480989838353 | 0.922 |
| 0.9630480989838353 | 0.924 |
| 0.9648340512766652 | 0.924 |
| 0.9648340512766652 | 0.926 |
| 0.965455184495241 | 0.926 |
| 0.965455184495241 | 0.928 |
| 0.965690135846264 | 0.928 |
| 0.965690135846264 | 0.93 |
| 0.9657993358099659 | 0.93 |
| 0.9657993358099659 | 0.932 |
| 0.9658760098454251 | 0.932 |
| 0.9658760098454251 | 0.934 |
| 0.9671624313799172 | 0.934 |
| 0.9671624313799172 | 0.936 |
| 0.9672092302428584 | 0.936 |
| 0.9672092302428584 | 0.938 |
| 0.967859064375943 | 0.938 |
| 0.967859064375943 | 0.94 |
| 0.9686831393537327 | 0.94 |
| 0.9686831393537327 | 0.942 |
| 0.9697561251924683 | 0.942 |
| 0.9697561251924683 | 0.944 |
| 0.9739993015396289 | 0.944 |
| 0.9739993015396289 | 0.946 |
| 0.9740194166422599 | 0.946 |
| 0.9740194166422599 | 0.948 |
| 0.9753690149107984 | 0.948 |
| 0.9753690149107984 | 0.95 |
| 0.9758410901996665 | 0.95 |
| 0.9758410901996665 | 0.952 |
| 0.9761548636599043 | 0.952 |
| 0.9761548636599043 | 0.954 |
| 0.9761602680665266 | 0.954 |
| 0.9761602680665266 | 0.956 |
| 0.978230803632979 | 0.956 |
| 0.978230803632979 | 0.958 |
| 0.9789705386458849 | 0.958 |
| 0.9789705386458849 | 0.96 |
| 0.9790752105410397 | 0.96 |
| 0.9790752105410397 | 0.962 |
| 0.9795777699485165 | 0.962 |
| 0.9795777699485165 | 0.964 |
| 0.9801881445506245 | 0.964 |
| 0.9801881445506245 | 0.966 |
| 0.9812980990648462 | 0.966 |
| 0.9812980990648462 | 0.968 |
| 0.981302746713455 | 0.968 |
| 0.981302746713455 | 0.97 |
| 0.981766132092587 | 0.97 |
| 0.981766132092587 | 0.972 |
| 0.9829846923334751 | 0.972 |
| 0.9829846923334751 | 0.974 |
| 0.9837801749276872 | 0.974 |
| 0.9837801749276872 | 0.976 |
| 0.9846316922499566 | 0.976 |
| 0.9846316922499566 | 0.978 |
| 0.9850716452886346 | 0.978 |
| 0.9850716452886346 | 0.98 |
| 0.9856031352278322 | 0.98 |
| 0.9856031352278322 | 0.982 |
| 0.9863402712369784 | 0.982 |
| 0.9863402712369784 | 0.984 |
| 0.9867236024349031 | 0.984 |
| 0.9867236024349031 | 0.986 |
| 0.9886398178562716 | 0.986 |
| 0.9886398178562716 | 0.988 |
| 0.9899379280929662 | 0.988 |
| 0.9899379280929662 | 0.99 |
| 0.9929264796637345 | 0.99 |
| 0.9929264796637345 | 0.992 |
| 0.9938073181773431 | 0.992 |
| 0.9938073181773431 | 0.994 |
| 0.9955931044612027 | 0.994 |
| 0.9955931044612027 | 0.996 |
| 0.9993288614704078 | 0.996 |
| 0.9993288614704078 | 0.998 |
| 0.9996180887872703 | 0.998 |
| 0.9996180887872703 | 1 |